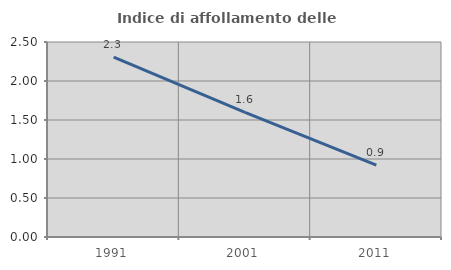
| Category | Indice di affollamento delle abitazioni  |
|---|---|
| 1991.0 | 2.305 |
| 2001.0 | 1.597 |
| 2011.0 | 0.922 |